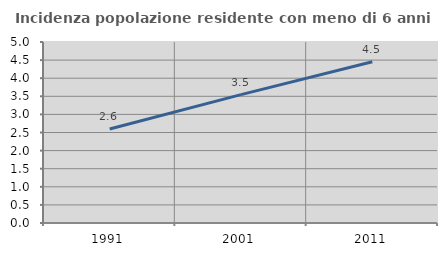
| Category | Incidenza popolazione residente con meno di 6 anni |
|---|---|
| 1991.0 | 2.598 |
| 2001.0 | 3.546 |
| 2011.0 | 4.454 |